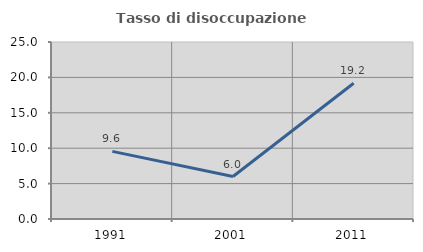
| Category | Tasso di disoccupazione giovanile  |
|---|---|
| 1991.0 | 9.551 |
| 2001.0 | 6 |
| 2011.0 | 19.169 |